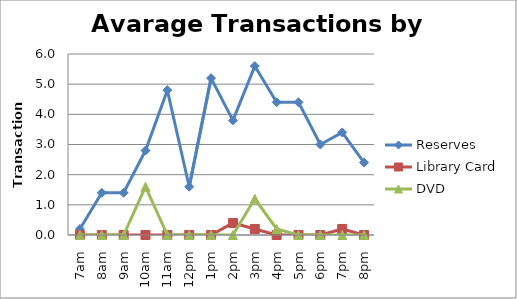
| Category | Reserves | Library Card | DVD |
|---|---|---|---|
| 7am | 0.2 | 0 | 0 |
| 8am | 1.4 | 0 | 0 |
| 9am | 1.4 | 0 | 0 |
| 10am | 2.8 | 0 | 1.6 |
| 11am | 4.8 | 0 | 0 |
| 12pm | 1.6 | 0 | 0 |
| 1pm | 5.2 | 0 | 0 |
| 2pm | 3.8 | 0.4 | 0 |
| 3pm | 5.6 | 0.2 | 1.2 |
| 4pm | 4.4 | 0 | 0.2 |
| 5pm | 4.4 | 0 | 0 |
| 6pm | 3 | 0 | 0 |
| 7pm | 3.4 | 0.2 | 0 |
| 8pm | 2.4 | 0 | 0 |